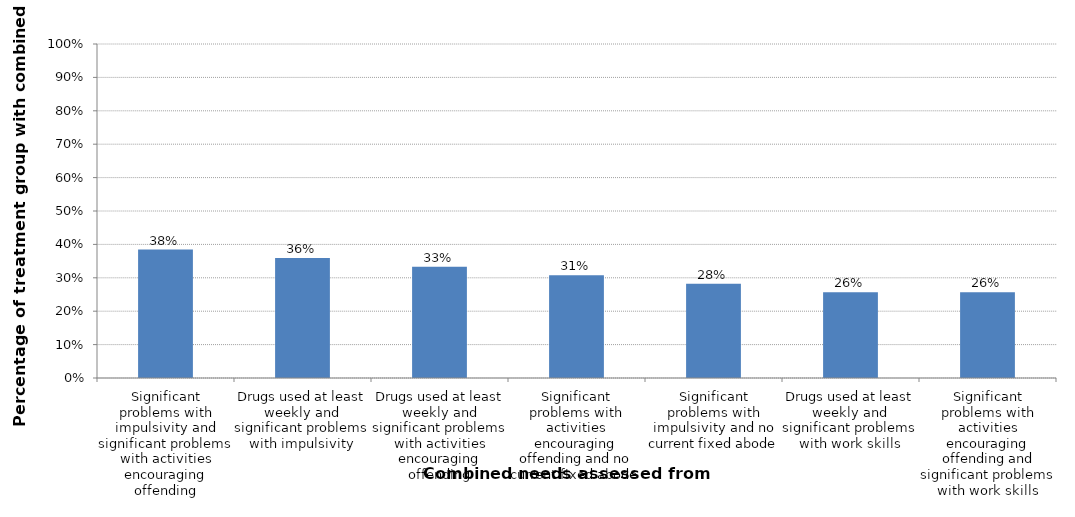
| Category | Percentage of treatment group with combined need |
|---|---|
| Significant problems with impulsivity and significant problems with activities encouraging offending | 0.385 |
| Drugs used at least weekly and significant problems with impulsivity | 0.359 |
| Drugs used at least weekly and significant problems with activities encouraging offending | 0.333 |
| Significant problems with activities encouraging offending and no current fixed abode | 0.308 |
| Significant problems with impulsivity and no current fixed abode | 0.282 |
| Drugs used at least weekly and significant problems with work skills | 0.256 |
| Significant problems with activities encouraging offending and significant problems with work skills | 0.256 |